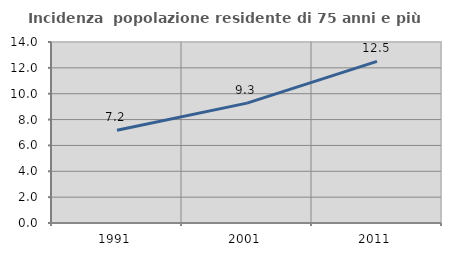
| Category | Incidenza  popolazione residente di 75 anni e più |
|---|---|
| 1991.0 | 7.175 |
| 2001.0 | 9.274 |
| 2011.0 | 12.5 |